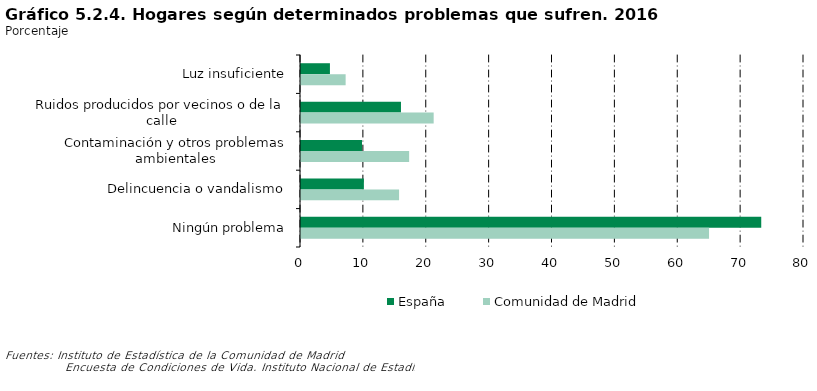
| Category | España | Comunidad de Madrid |
|---|---|---|
| Luz insuficiente | 4.6 | 7.1 |
| Ruidos producidos por vecinos o de la calle | 15.9 | 21.1 |
| Contaminación y otros problemas ambientales | 9.7 | 17.2 |
| Delincuencia o vandalismo | 10 | 15.6 |
| Ningún problema | 73.2 | 64.9 |